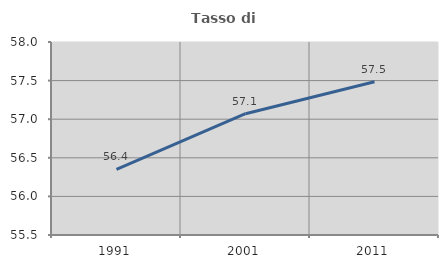
| Category | Tasso di occupazione   |
|---|---|
| 1991.0 | 56.351 |
| 2001.0 | 57.071 |
| 2011.0 | 57.484 |